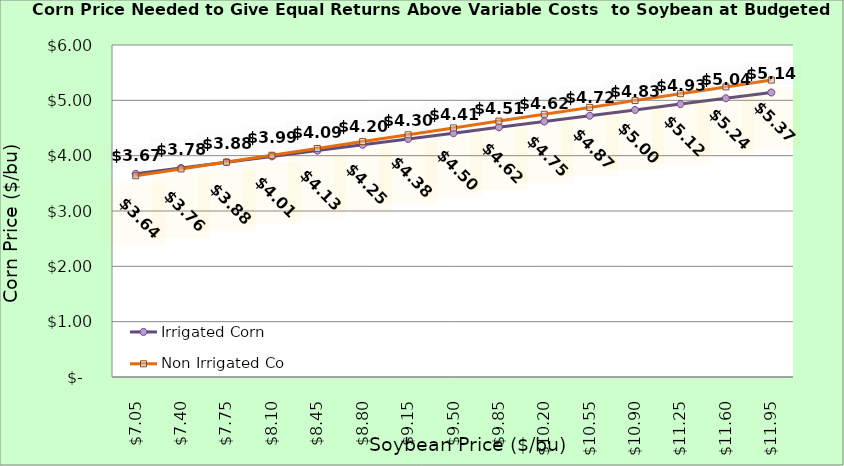
| Category | Irrigated Corn | Non Irrigated Corn |
|---|---|---|
| 7.0500000000000025 | 3.672 | 3.637 |
| 7.400000000000002 | 3.777 | 3.76 |
| 7.750000000000002 | 3.882 | 3.884 |
| 8.100000000000001 | 3.987 | 4.007 |
| 8.450000000000001 | 4.092 | 4.131 |
| 8.8 | 4.197 | 4.254 |
| 9.15 | 4.302 | 4.378 |
| 9.5 | 4.407 | 4.501 |
| 9.85 | 4.512 | 4.625 |
| 10.2 | 4.617 | 4.749 |
| 10.549999999999999 | 4.722 | 4.872 |
| 10.899999999999999 | 4.827 | 4.996 |
| 11.249999999999998 | 4.932 | 5.119 |
| 11.599999999999998 | 5.037 | 5.243 |
| 11.949999999999998 | 5.142 | 5.366 |